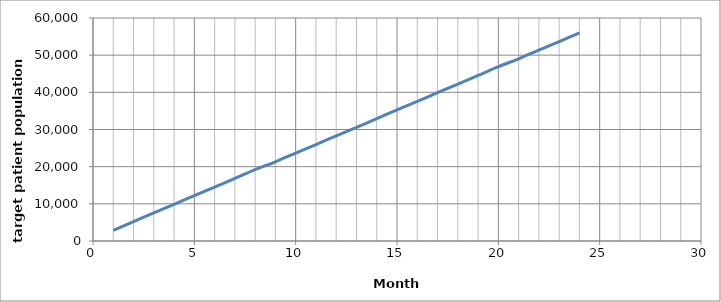
| Category | Series 0 |
|---|---|
| 0 | 2876712.329 |
| 1 | 5229315.068 |
| 2 | 7581917.808 |
| 3 | 9858630.137 |
| 4 | 12211232.877 |
| 5 | 14487945.205 |
| 6 | 16840547.945 |
| 7 | 19193150.685 |
| 8 | 21318082.192 |
| 9 | 23670684.932 |
| 10 | 25947397.26 |
| 11 | 28300000 |
| 12 | 30576712.329 |
| 13 | 32929315.068 |
| 14 | 35281917.808 |
| 15 | 37558630.137 |
| 16 | 39911232.877 |
| 17 | 42187945.205 |
| 18 | 44540547.945 |
| 19 | 46893150.685 |
| 20 | 49018082.192 |
| 21 | 51370684.932 |
| 22 | 53647397.26 |
| 23 | 56000000 |
| 24 | 0 |
| 25 | 0 |
| 26 | 0 |
| 27 | 0 |
| 28 | 0 |
| 29 | 0 |
| 30 | 0 |
| 31 | 0 |
| 32 | 0 |
| 33 | 0 |
| 34 | 0 |
| 35 | 0 |
| 36 | 0 |
| 37 | 0 |
| 38 | 0 |
| 39 | 0 |
| 40 | 0 |
| 41 | 0 |
| 42 | 0 |
| 43 | 0 |
| 44 | 0 |
| 45 | 0 |
| 46 | 0 |
| 47 | 0 |
| 48 | 0 |
| 49 | 0 |
| 50 | 0 |
| 51 | 0 |
| 52 | 0 |
| 53 | 0 |
| 54 | 0 |
| 55 | 0 |
| 56 | 0 |
| 57 | 0 |
| 58 | 0 |
| 59 | 0 |
| 60 | 0 |
| 61 | 0 |
| 62 | 0 |
| 63 | 0 |
| 64 | 0 |
| 65 | 0 |
| 66 | 0 |
| 67 | 0 |
| 68 | 0 |
| 69 | 0 |
| 70 | 0 |
| 71 | 0 |
| 72 | 0 |
| 73 | 0 |
| 74 | 0 |
| 75 | 0 |
| 76 | 0 |
| 77 | 0 |
| 78 | 0 |
| 79 | 0 |
| 80 | 0 |
| 81 | 0 |
| 82 | 0 |
| 83 | 0 |
| 84 | 0 |
| 85 | 0 |
| 86 | 0 |
| 87 | 0 |
| 88 | 0 |
| 89 | 0 |
| 90 | 0 |
| 91 | 0 |
| 92 | 0 |
| 93 | 0 |
| 94 | 0 |
| 95 | 0 |
| 96 | 0 |
| 97 | 0 |
| 98 | 0 |
| 99 | 0 |
| 100 | 0 |
| 101 | 0 |
| 102 | 0 |
| 103 | 0 |
| 104 | 0 |
| 105 | 0 |
| 106 | 0 |
| 107 | 0 |
| 108 | 0 |
| 109 | 0 |
| 110 | 0 |
| 111 | 0 |
| 112 | 0 |
| 113 | 0 |
| 114 | 0 |
| 115 | 0 |
| 116 | 0 |
| 117 | 0 |
| 118 | 0 |
| 119 | 0 |
| 120 | 0 |
| 121 | 0 |
| 122 | 0 |
| 123 | 0 |
| 124 | 0 |
| 125 | 0 |
| 126 | 0 |
| 127 | 0 |
| 128 | 0 |
| 129 | 0 |
| 130 | 0 |
| 131 | 0 |
| 132 | 0 |
| 133 | 0 |
| 134 | 0 |
| 135 | 0 |
| 136 | 0 |
| 137 | 0 |
| 138 | 0 |
| 139 | 0 |
| 140 | 0 |
| 141 | 0 |
| 142 | 0 |
| 143 | 0 |
| 144 | 0 |
| 145 | 0 |
| 146 | 0 |
| 147 | 0 |
| 148 | 0 |
| 149 | 0 |
| 150 | 0 |
| 151 | 0 |
| 152 | 0 |
| 153 | 0 |
| 154 | 0 |
| 155 | 0 |
| 156 | 0 |
| 157 | 0 |
| 158 | 0 |
| 159 | 0 |
| 160 | 0 |
| 161 | 0 |
| 162 | 0 |
| 163 | 0 |
| 164 | 0 |
| 165 | 0 |
| 166 | 0 |
| 167 | 0 |
| 168 | 0 |
| 169 | 0 |
| 170 | 0 |
| 171 | 0 |
| 172 | 0 |
| 173 | 0 |
| 174 | 0 |
| 175 | 0 |
| 176 | 0 |
| 177 | 0 |
| 178 | 0 |
| 179 | 0 |
| 180 | 0 |
| 181 | 0 |
| 182 | 0 |
| 183 | 0 |
| 184 | 0 |
| 185 | 0 |
| 186 | 0 |
| 187 | 0 |
| 188 | 0 |
| 189 | 0 |
| 190 | 0 |
| 191 | 0 |
| 192 | 0 |
| 193 | 0 |
| 194 | 0 |
| 195 | 0 |
| 196 | 0 |
| 197 | 0 |
| 198 | 0 |
| 199 | 0 |
| 200 | 0 |
| 201 | 0 |
| 202 | 0 |
| 203 | 0 |
| 204 | 0 |
| 205 | 0 |
| 206 | 0 |
| 207 | 0 |
| 208 | 0 |
| 209 | 0 |
| 210 | 0 |
| 211 | 0 |
| 212 | 0 |
| 213 | 0 |
| 214 | 0 |
| 215 | 0 |
| 216 | 0 |
| 217 | 0 |
| 218 | 0 |
| 219 | 0 |
| 220 | 0 |
| 221 | 0 |
| 222 | 0 |
| 223 | 0 |
| 224 | 0 |
| 225 | 0 |
| 226 | 0 |
| 227 | 0 |
| 228 | 0 |
| 229 | 0 |
| 230 | 0 |
| 231 | 0 |
| 232 | 0 |
| 233 | 0 |
| 234 | 0 |
| 235 | 0 |
| 236 | 0 |
| 237 | 0 |
| 238 | 0 |
| 239 | 0 |
| 240 | 0 |
| 241 | 0 |
| 242 | 0 |
| 243 | 0 |
| 244 | 0 |
| 245 | 0 |
| 246 | 0 |
| 247 | 0 |
| 248 | 0 |
| 249 | 0 |
| 250 | 0 |
| 251 | 0 |
| 252 | 0 |
| 253 | 0 |
| 254 | 0 |
| 255 | 0 |
| 256 | 0 |
| 257 | 0 |
| 258 | 0 |
| 259 | 0 |
| 260 | 0 |
| 261 | 0 |
| 262 | 0 |
| 263 | 0 |
| 264 | 0 |
| 265 | 0 |
| 266 | 0 |
| 267 | 0 |
| 268 | 0 |
| 269 | 0 |
| 270 | 0 |
| 271 | 0 |
| 272 | 0 |
| 273 | 0 |
| 274 | 0 |
| 275 | 0 |
| 276 | 0 |
| 277 | 0 |
| 278 | 0 |
| 279 | 0 |
| 280 | 0 |
| 281 | 0 |
| 282 | 0 |
| 283 | 0 |
| 284 | 0 |
| 285 | 0 |
| 286 | 0 |
| 287 | 0 |
| 288 | 0 |
| 289 | 0 |
| 290 | 0 |
| 291 | 0 |
| 292 | 0 |
| 293 | 0 |
| 294 | 0 |
| 295 | 0 |
| 296 | 0 |
| 297 | 0 |
| 298 | 0 |
| 299 | 0 |
| 300 | 0 |
| 301 | 0 |
| 302 | 0 |
| 303 | 0 |
| 304 | 0 |
| 305 | 0 |
| 306 | 0 |
| 307 | 0 |
| 308 | 0 |
| 309 | 0 |
| 310 | 0 |
| 311 | 0 |
| 312 | 0 |
| 313 | 0 |
| 314 | 0 |
| 315 | 0 |
| 316 | 0 |
| 317 | 0 |
| 318 | 0 |
| 319 | 0 |
| 320 | 0 |
| 321 | 0 |
| 322 | 0 |
| 323 | 0 |
| 324 | 0 |
| 325 | 0 |
| 326 | 0 |
| 327 | 0 |
| 328 | 0 |
| 329 | 0 |
| 330 | 0 |
| 331 | 0 |
| 332 | 0 |
| 333 | 0 |
| 334 | 0 |
| 335 | 0 |
| 336 | 0 |
| 337 | 0 |
| 338 | 0 |
| 339 | 0 |
| 340 | 0 |
| 341 | 0 |
| 342 | 0 |
| 343 | 0 |
| 344 | 0 |
| 345 | 0 |
| 346 | 0 |
| 347 | 0 |
| 348 | 0 |
| 349 | 0 |
| 350 | 0 |
| 351 | 0 |
| 352 | 0 |
| 353 | 0 |
| 354 | 0 |
| 355 | 0 |
| 356 | 0 |
| 357 | 0 |
| 358 | 0 |
| 359 | 0 |
| 360 | 0 |
| 361 | 0 |
| 362 | 0 |
| 363 | 0 |
| 364 | 0 |
| 365 | 0 |
| 366 | 0 |
| 367 | 0 |
| 368 | 0 |
| 369 | 0 |
| 370 | 0 |
| 371 | 0 |
| 372 | 0 |
| 373 | 0 |
| 374 | 0 |
| 375 | 0 |
| 376 | 0 |
| 377 | 0 |
| 378 | 0 |
| 379 | 0 |
| 380 | 0 |
| 381 | 0 |
| 382 | 0 |
| 383 | 0 |
| 384 | 0 |
| 385 | 0 |
| 386 | 0 |
| 387 | 0 |
| 388 | 0 |
| 389 | 0 |
| 390 | 0 |
| 391 | 0 |
| 392 | 0 |
| 393 | 0 |
| 394 | 0 |
| 395 | 0 |
| 396 | 0 |
| 397 | 0 |
| 398 | 0 |
| 399 | 0 |
| 400 | 0 |
| 401 | 0 |
| 402 | 0 |
| 403 | 0 |
| 404 | 0 |
| 405 | 0 |
| 406 | 0 |
| 407 | 0 |
| 408 | 0 |
| 409 | 0 |
| 410 | 0 |
| 411 | 0 |
| 412 | 0 |
| 413 | 0 |
| 414 | 0 |
| 415 | 0 |
| 416 | 0 |
| 417 | 0 |
| 418 | 0 |
| 419 | 0 |
| 420 | 0 |
| 421 | 0 |
| 422 | 0 |
| 423 | 0 |
| 424 | 0 |
| 425 | 0 |
| 426 | 0 |
| 427 | 0 |
| 428 | 0 |
| 429 | 0 |
| 430 | 0 |
| 431 | 0 |
| 432 | 0 |
| 433 | 0 |
| 434 | 0 |
| 435 | 0 |
| 436 | 0 |
| 437 | 0 |
| 438 | 0 |
| 439 | 0 |
| 440 | 0 |
| 441 | 0 |
| 442 | 0 |
| 443 | 0 |
| 444 | 0 |
| 445 | 0 |
| 446 | 0 |
| 447 | 0 |
| 448 | 0 |
| 449 | 0 |
| 450 | 0 |
| 451 | 0 |
| 452 | 0 |
| 453 | 0 |
| 454 | 0 |
| 455 | 0 |
| 456 | 0 |
| 457 | 0 |
| 458 | 0 |
| 459 | 0 |
| 460 | 0 |
| 461 | 0 |
| 462 | 0 |
| 463 | 0 |
| 464 | 0 |
| 465 | 0 |
| 466 | 0 |
| 467 | 0 |
| 468 | 0 |
| 469 | 0 |
| 470 | 0 |
| 471 | 0 |
| 472 | 0 |
| 473 | 0 |
| 474 | 0 |
| 475 | 0 |
| 476 | 0 |
| 477 | 0 |
| 478 | 0 |
| 479 | 0 |
| 480 | 0 |
| 481 | 0 |
| 482 | 0 |
| 483 | 0 |
| 484 | 0 |
| 485 | 0 |
| 486 | 0 |
| 487 | 0 |
| 488 | 0 |
| 489 | 0 |
| 490 | 0 |
| 491 | 0 |
| 492 | 0 |
| 493 | 0 |
| 494 | 0 |
| 495 | 0 |
| 496 | 0 |
| 497 | 0 |
| 498 | 0 |
| 499 | 0 |
| 500 | 0 |
| 501 | 0 |
| 502 | 0 |
| 503 | 0 |
| 504 | 0 |
| 505 | 0 |
| 506 | 0 |
| 507 | 0 |
| 508 | 0 |
| 509 | 0 |
| 510 | 0 |
| 511 | 0 |
| 512 | 0 |
| 513 | 0 |
| 514 | 0 |
| 515 | 0 |
| 516 | 0 |
| 517 | 0 |
| 518 | 0 |
| 519 | 0 |
| 520 | 0 |
| 521 | 0 |
| 522 | 0 |
| 523 | 0 |
| 524 | 0 |
| 525 | 0 |
| 526 | 0 |
| 527 | 0 |
| 528 | 0 |
| 529 | 0 |
| 530 | 0 |
| 531 | 0 |
| 532 | 0 |
| 533 | 0 |
| 534 | 0 |
| 535 | 0 |
| 536 | 0 |
| 537 | 0 |
| 538 | 0 |
| 539 | 0 |
| 540 | 0 |
| 541 | 0 |
| 542 | 0 |
| 543 | 0 |
| 544 | 0 |
| 545 | 0 |
| 546 | 0 |
| 547 | 0 |
| 548 | 0 |
| 549 | 0 |
| 550 | 0 |
| 551 | 0 |
| 552 | 0 |
| 553 | 0 |
| 554 | 0 |
| 555 | 0 |
| 556 | 0 |
| 557 | 0 |
| 558 | 0 |
| 559 | 0 |
| 560 | 0 |
| 561 | 0 |
| 562 | 0 |
| 563 | 0 |
| 564 | 0 |
| 565 | 0 |
| 566 | 0 |
| 567 | 0 |
| 568 | 0 |
| 569 | 0 |
| 570 | 0 |
| 571 | 0 |
| 572 | 0 |
| 573 | 0 |
| 574 | 0 |
| 575 | 0 |
| 576 | 0 |
| 577 | 0 |
| 578 | 0 |
| 579 | 0 |
| 580 | 0 |
| 581 | 0 |
| 582 | 0 |
| 583 | 0 |
| 584 | 0 |
| 585 | 0 |
| 586 | 0 |
| 587 | 0 |
| 588 | 0 |
| 589 | 0 |
| 590 | 0 |
| 591 | 0 |
| 592 | 0 |
| 593 | 0 |
| 594 | 0 |
| 595 | 0 |
| 596 | 0 |
| 597 | 0 |
| 598 | 0 |
| 599 | 0 |
| 600 | 0 |
| 601 | 0 |
| 602 | 0 |
| 603 | 0 |
| 604 | 0 |
| 605 | 0 |
| 606 | 0 |
| 607 | 0 |
| 608 | 0 |
| 609 | 0 |
| 610 | 0 |
| 611 | 0 |
| 612 | 0 |
| 613 | 0 |
| 614 | 0 |
| 615 | 0 |
| 616 | 0 |
| 617 | 0 |
| 618 | 0 |
| 619 | 0 |
| 620 | 0 |
| 621 | 0 |
| 622 | 0 |
| 623 | 0 |
| 624 | 0 |
| 625 | 0 |
| 626 | 0 |
| 627 | 0 |
| 628 | 0 |
| 629 | 0 |
| 630 | 0 |
| 631 | 0 |
| 632 | 0 |
| 633 | 0 |
| 634 | 0 |
| 635 | 0 |
| 636 | 0 |
| 637 | 0 |
| 638 | 0 |
| 639 | 0 |
| 640 | 0 |
| 641 | 0 |
| 642 | 0 |
| 643 | 0 |
| 644 | 0 |
| 645 | 0 |
| 646 | 0 |
| 647 | 0 |
| 648 | 0 |
| 649 | 0 |
| 650 | 0 |
| 651 | 0 |
| 652 | 0 |
| 653 | 0 |
| 654 | 0 |
| 655 | 0 |
| 656 | 0 |
| 657 | 0 |
| 658 | 0 |
| 659 | 0 |
| 660 | 0 |
| 661 | 0 |
| 662 | 0 |
| 663 | 0 |
| 664 | 0 |
| 665 | 0 |
| 666 | 0 |
| 667 | 0 |
| 668 | 0 |
| 669 | 0 |
| 670 | 0 |
| 671 | 0 |
| 672 | 0 |
| 673 | 0 |
| 674 | 0 |
| 675 | 0 |
| 676 | 0 |
| 677 | 0 |
| 678 | 0 |
| 679 | 0 |
| 680 | 0 |
| 681 | 0 |
| 682 | 0 |
| 683 | 0 |
| 684 | 0 |
| 685 | 0 |
| 686 | 0 |
| 687 | 0 |
| 688 | 0 |
| 689 | 0 |
| 690 | 0 |
| 691 | 0 |
| 692 | 0 |
| 693 | 0 |
| 694 | 0 |
| 695 | 0 |
| 696 | 0 |